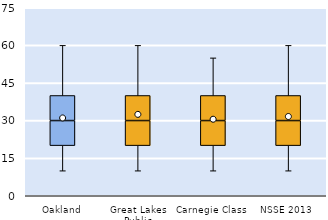
| Category | 25th | 50th | 75th |
|---|---|---|---|
| Oakland | 20 | 10 | 10 |
| Great Lakes Public | 20 | 10 | 10 |
| Carnegie Class | 20 | 10 | 10 |
| NSSE 2013 | 20 | 10 | 10 |